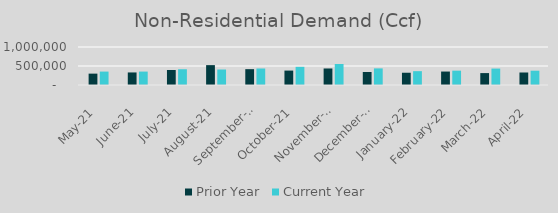
| Category | Prior Year | Current Year |
|---|---|---|
| 2021-05-01 | 299245.56 | 353085 |
| 2021-06-01 | 330441.187 | 353141.442 |
| 2021-07-01 | 394304.316 | 414577.112 |
| 2021-08-01 | 522963.473 | 407774.995 |
| 2021-09-01 | 416886.629 | 434192.442 |
| 2021-10-01 | 379515 | 477878.526 |
| 2021-11-01 | 434815 | 552599.698 |
| 2021-12-01 | 342584.594 | 436956.784 |
| 2022-01-01 | 322657.16 | 364164.019 |
| 2022-02-01 | 354041 | 377149.369 |
| 2022-03-01 | 313343 | 432270.798 |
| 2022-04-01 | 329084.722 | 376255.784 |